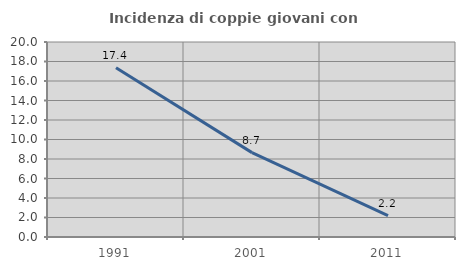
| Category | Incidenza di coppie giovani con figli |
|---|---|
| 1991.0 | 17.355 |
| 2001.0 | 8.654 |
| 2011.0 | 2.198 |